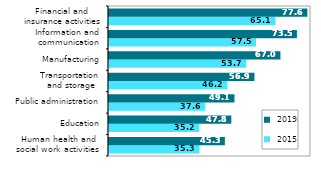
| Category |  2015 |  2019 |
|---|---|---|
| Human health and
social work activities  | 35.302 | 45.31 |
| Education | 35.196 | 47.832 |
| Public administration | 37.628 | 49.067 |
| Transportation
 and storage | 46.208 | 56.884 |
| Manufacturing | 53.686 | 67.043 |
| Information and
 communication | 57.488 | 73.49 |
| Financial and
 insurance activities | 65.086 | 77.583 |